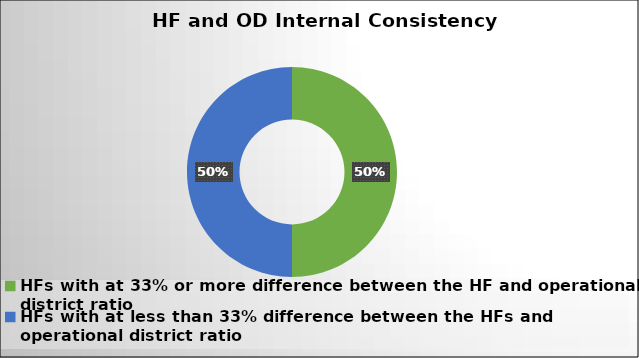
| Category | Series 0 |
|---|---|
| HFs with at 33% or more difference between the HF and operational district ratio | 50 |
| HFs with at less than 33% difference between the HFs and operational district ratio | 50 |